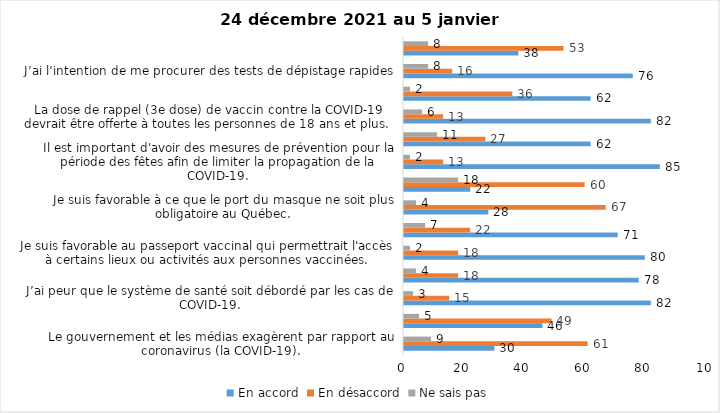
| Category | En accord | En désaccord | Ne sais pas |
|---|---|---|---|
| Le gouvernement et les médias exagèrent par rapport au coronavirus (la COVID-19). | 30 | 61 | 9 |
| Je suis favorable à la mise en place d’un couvre-feu. | 46 | 49 | 5 |
| J’ai peur que le système de santé soit débordé par les cas de COVID-19. | 82 | 15 | 3 |
| Je suis inquiet/inquiète que le nombre de cas augmente en raison des nouveaux variants du virus de la COVID-19. | 78 | 18 | 4 |
| Je suis favorable au passeport vaccinal qui permettrait l'accès à certains lieux ou activités aux personnes vaccinées. | 80 | 18 | 2 |
| Je suis confiant que la vaccination protège efficacement contre les variants de la COVID-19 | 71 | 22 | 7 |
| Je suis favorable à ce que le port du masque ne soit plus obligatoire au Québec. | 28 | 67 | 4 |
| La vaccination des enfants entre 5 et 11 ans mettra fin à la pandémie. | 22 | 60 | 18 |
| Il est important d'avoir des mesures de prévention pour la période des fêtes afin de limiter la propagation de la COVID-19. | 85 | 13 | 2 |
| La pandémie ne sera pas terminée au Québec avant que tous les habitants de la terre puissent être vaccinés contre la COVID-19.   | 62 | 27 | 11 |
| La dose de rappel (3e dose) de vaccin contre la COVID-19 devrait être offerte à toutes les personnes de 18 ans et plus.  | 82 | 13 | 6 |
| Je suis inconfortable d’être en contact avec une personne non vaccinée contre la COVID-19 | 62 | 36 | 2 |
| J’ai l’intention de me procurer des tests de dépistage rapides | 76 | 16 | 8 |
| Je n'ai pas peur du variant Omicron, car il semble moins dangereux pour la santé. | 38 | 53 | 8 |